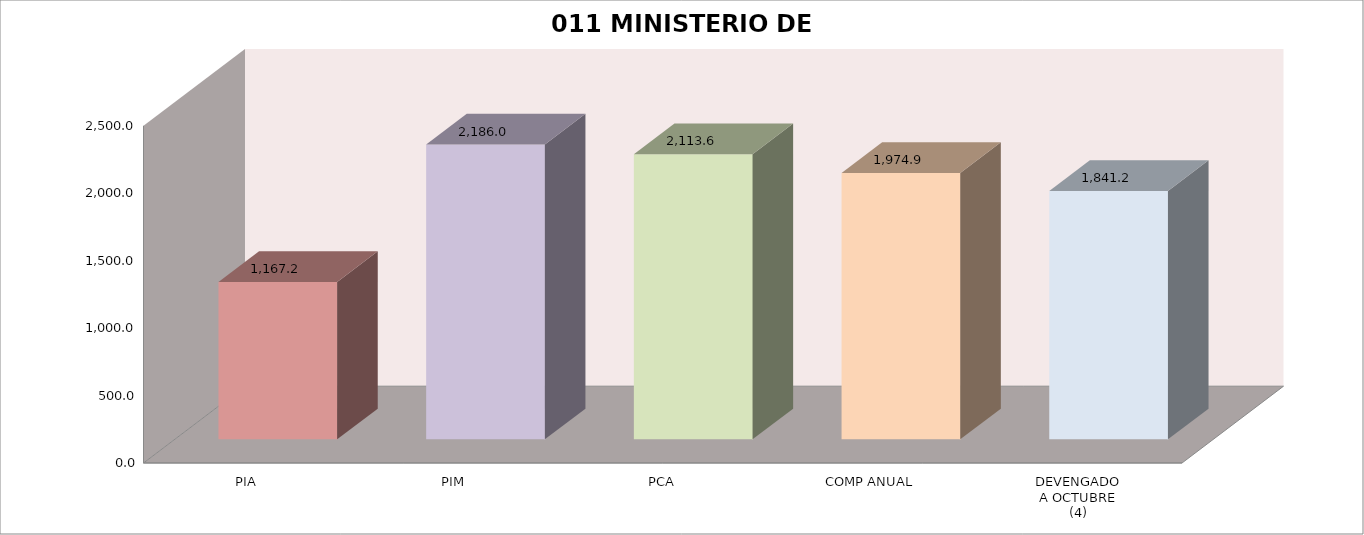
| Category | 011 MINISTERIO DE SALUD |
|---|---|
| PIA | 1167.209 |
| PIM | 2186.029 |
| PCA | 2113.632 |
| COMP ANUAL | 1974.875 |
| DEVENGADO
A OCTUBRE
(4) | 1841.192 |